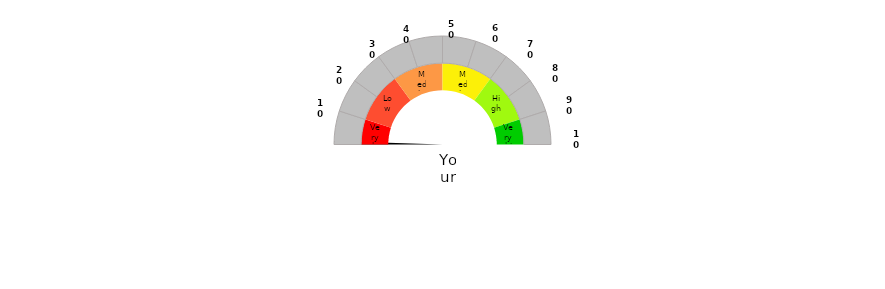
| Category | Pointer |
|---|---|
| 0 | 0 |
| 1 | 1 |
| 2 | 200 |